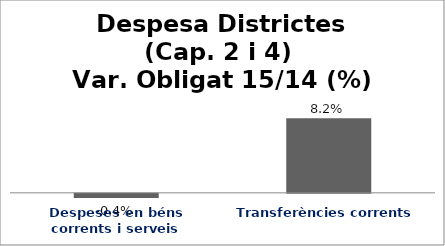
| Category | Series 0 |
|---|---|
| Despeses en béns corrents i serveis | -0.004 |
| Transferències corrents | 0.082 |